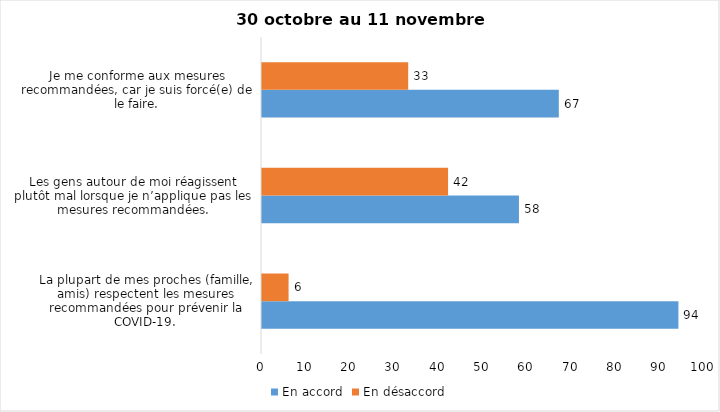
| Category | En accord | En désaccord |
|---|---|---|
| La plupart de mes proches (famille, amis) respectent les mesures recommandées pour prévenir la COVID-19. | 94 | 6 |
| Les gens autour de moi réagissent plutôt mal lorsque je n’applique pas les mesures recommandées. | 58 | 42 |
| Je me conforme aux mesures recommandées, car je suis forcé(e) de le faire. | 67 | 33 |